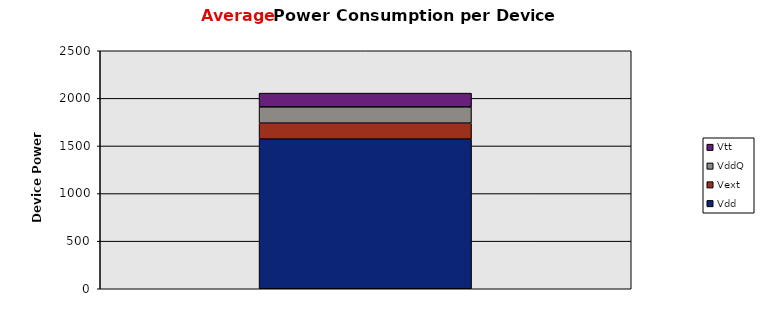
| Category | Vdd | Vext | VddQ | Vtt |
|---|---|---|---|---|
| 0 | 1571.886 | 167.4 | 171.461 | 144.166 |